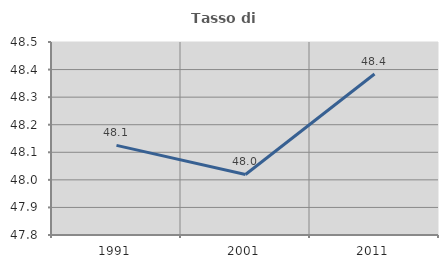
| Category | Tasso di occupazione   |
|---|---|
| 1991.0 | 48.125 |
| 2001.0 | 48.02 |
| 2011.0 | 48.384 |